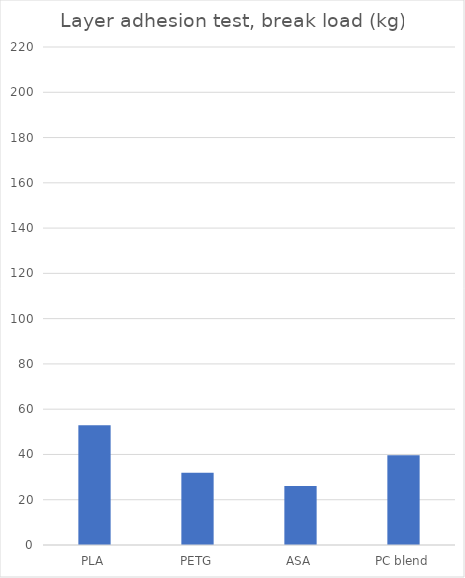
| Category | Average |
|---|---|
| PLA | 52.9 |
| PETG | 31.9 |
| ASA | 26.1 |
| PC blend | 39.7 |